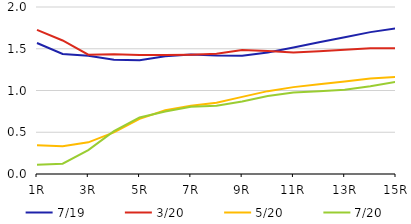
| Category | 7/19 | 3/20 | 5/20 | 7/20 |
|---|---|---|---|---|
|  1R | 1.568 | 1.726 | 0.344 | 0.111 |
|  2R | 1.437 | 1.599 | 0.332 | 0.123 |
|  3R | 1.416 | 1.429 | 0.379 | 0.286 |
|  4R | 1.37 | 1.435 | 0.499 | 0.512 |
|  5R | 1.363 | 1.425 | 0.66 | 0.678 |
|  6R | 1.411 | 1.425 | 0.764 | 0.748 |
|  7R | 1.431 | 1.429 | 0.819 | 0.806 |
|  8R | 1.42 | 1.439 | 0.854 | 0.818 |
|  9R | 1.417 | 1.486 | 0.923 | 0.869 |
|  10R | 1.456 | 1.474 | 0.992 | 0.934 |
|  11R | 1.516 | 1.454 | 1.04 | 0.977 |
|  12R | 1.577 | 1.471 | 1.074 | 0.992 |
|  13R | 1.638 | 1.488 | 1.108 | 1.008 |
|  14R | 1.699 | 1.505 | 1.143 | 1.052 |
|  15R | 1.744 | 1.506 | 1.162 | 1.104 |